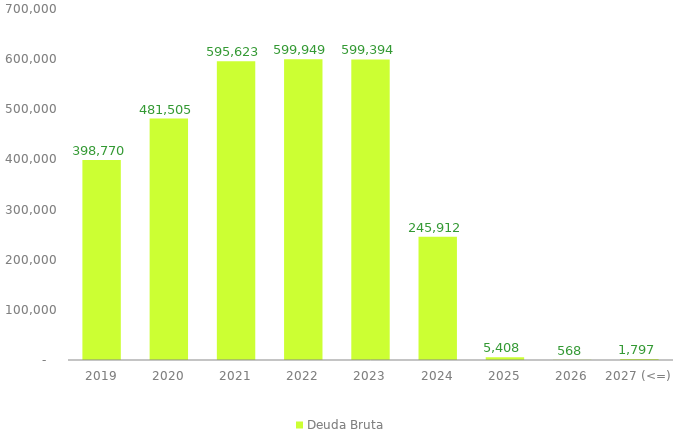
| Category | Deuda Bruta |
|---|---|
| 2019 | 398769.942 |
| 2020 | 481505.441 |
| 2021 | 595622.514 |
| 2022 | 599948.663 |
| 2023 | 599394.04 |
| 2024 | 245911.96 |
| 2025 | 5407.91 |
| 2026 | 567.533 |
| 2027 (<=) | 1797.188 |